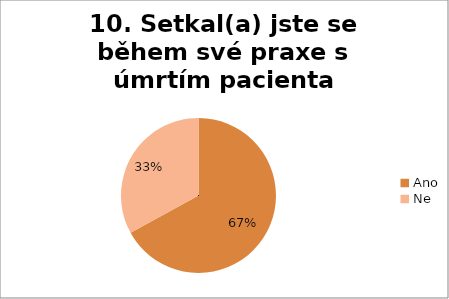
| Category | 10. Setkal(a) jste se během své praxe s úmrtím pacienta |
|---|---|
| Ano | 0.67 |
| Ne | 0.33 |